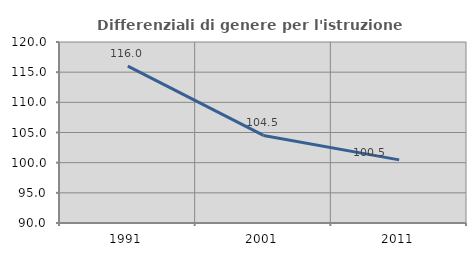
| Category | Differenziali di genere per l'istruzione superiore |
|---|---|
| 1991.0 | 115.997 |
| 2001.0 | 104.514 |
| 2011.0 | 100.465 |